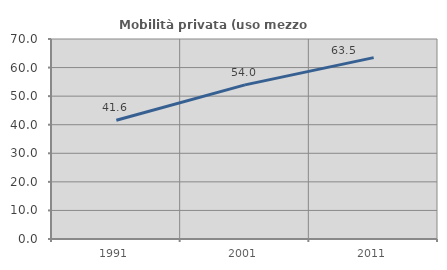
| Category | Mobilità privata (uso mezzo privato) |
|---|---|
| 1991.0 | 41.578 |
| 2001.0 | 53.953 |
| 2011.0 | 63.477 |